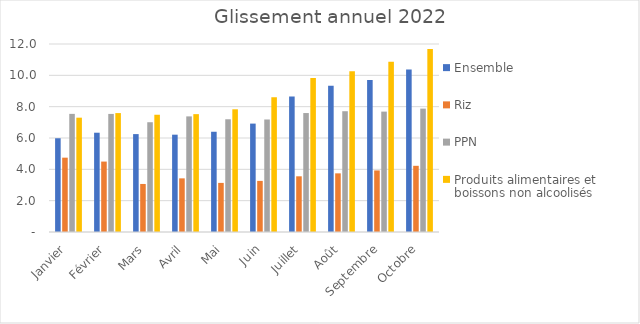
| Category |  Ensemble  |  Riz  |  PPN  |  Produits alimentaires et boissons non alcoolisés  |
|---|---|---|---|---|
| Janvier | 5.984 | 4.745 | 7.54 | 7.297 |
| Février | 6.337 | 4.495 | 7.537 | 7.591 |
| Mars | 6.249 | 3.066 | 7.006 | 7.484 |
| Avril | 6.212 | 3.424 | 7.38 | 7.523 |
| Mai | 6.399 | 3.134 | 7.195 | 7.832 |
| Juin | 6.919 | 3.263 | 7.182 | 8.599 |
| Juillet | 8.653 | 3.555 | 7.593 | 9.833 |
| Août | 9.327 | 3.744 | 7.709 | 10.254 |
| Septembre | 9.698 | 3.929 | 7.684 | 10.86 |
| Octobre | 10.366 | 4.224 | 7.875 | 11.681 |